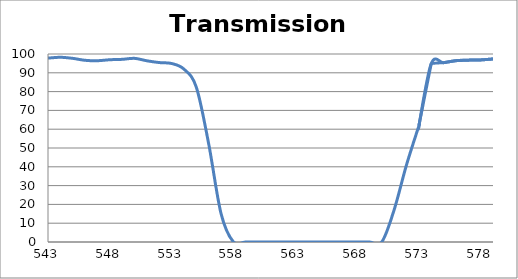
| Category | Transmission (%) |
|---|---|
| 2600.0 | 92.114 |
| 2599.0 | 92.203 |
| 2598.0 | 92.326 |
| 2597.0 | 92.426 |
| 2596.0 | 92.522 |
| 2595.0 | 92.617 |
| 2594.0 | 92.727 |
| 2593.0 | 92.835 |
| 2592.0 | 92.89 |
| 2591.0 | 92.995 |
| 2590.0 | 93.116 |
| 2589.0 | 93.186 |
| 2588.0 | 93.271 |
| 2587.0 | 93.36 |
| 2586.0 | 93.403 |
| 2585.0 | 93.418 |
| 2584.0 | 93.468 |
| 2583.0 | 93.502 |
| 2582.0 | 93.578 |
| 2581.0 | 93.599 |
| 2580.0 | 93.636 |
| 2579.0 | 93.667 |
| 2578.0 | 93.708 |
| 2577.0 | 93.737 |
| 2576.0 | 93.742 |
| 2575.0 | 93.785 |
| 2574.0 | 93.809 |
| 2573.0 | 93.809 |
| 2572.0 | 93.773 |
| 2571.0 | 93.778 |
| 2570.0 | 93.733 |
| 2569.0 | 93.734 |
| 2568.0 | 93.763 |
| 2567.0 | 93.677 |
| 2566.0 | 93.69 |
| 2565.0 | 93.678 |
| 2564.0 | 93.588 |
| 2563.0 | 93.552 |
| 2562.0 | 93.538 |
| 2561.0 | 93.467 |
| 2560.0 | 93.405 |
| 2559.0 | 93.328 |
| 2558.0 | 93.276 |
| 2557.0 | 93.203 |
| 2556.0 | 93.128 |
| 2555.0 | 92.994 |
| 2554.0 | 92.855 |
| 2553.0 | 92.7 |
| 2552.0 | 92.556 |
| 2551.0 | 92.392 |
| 2550.0 | 92.189 |
| 2549.0 | 92.025 |
| 2548.0 | 91.843 |
| 2547.0 | 91.636 |
| 2546.0 | 91.442 |
| 2545.0 | 91.264 |
| 2544.0 | 91.101 |
| 2543.0 | 90.962 |
| 2542.0 | 90.813 |
| 2541.0 | 90.681 |
| 2540.0 | 90.547 |
| 2539.0 | 90.412 |
| 2538.0 | 90.283 |
| 2537.0 | 90.152 |
| 2536.0 | 90.088 |
| 2535.0 | 89.992 |
| 2534.0 | 89.943 |
| 2533.0 | 89.9 |
| 2532.0 | 89.881 |
| 2531.0 | 89.858 |
| 2530.0 | 89.851 |
| 2529.0 | 89.848 |
| 2528.0 | 89.924 |
| 2527.0 | 89.988 |
| 2526.0 | 90.039 |
| 2525.0 | 90.13 |
| 2524.0 | 90.246 |
| 2523.0 | 90.4 |
| 2522.0 | 90.508 |
| 2521.0 | 90.605 |
| 2520.0 | 90.794 |
| 2519.0 | 90.948 |
| 2518.0 | 91.08 |
| 2517.0 | 91.257 |
| 2516.0 | 91.443 |
| 2515.0 | 91.589 |
| 2514.0 | 91.717 |
| 2513.0 | 91.81 |
| 2512.0 | 91.892 |
| 2511.0 | 91.968 |
| 2510.0 | 92.042 |
| 2509.0 | 92.045 |
| 2508.0 | 92.023 |
| 2507.0 | 91.958 |
| 2506.0 | 91.87 |
| 2505.0 | 91.759 |
| 2504.0 | 91.586 |
| 2503.0 | 91.426 |
| 2502.0 | 91.185 |
| 2501.0 | 90.9 |
| 2500.0 | 90.588 |
| 2499.0 | 90.236 |
| 2498.0 | 89.873 |
| 2497.0 | 89.489 |
| 2496.0 | 89.097 |
| 2495.0 | 88.667 |
| 2494.0 | 88.212 |
| 2493.0 | 87.712 |
| 2492.0 | 87.227 |
| 2491.0 | 86.74 |
| 2490.0 | 86.259 |
| 2489.0 | 85.813 |
| 2488.0 | 85.375 |
| 2487.0 | 84.913 |
| 2486.0 | 84.462 |
| 2485.0 | 84.022 |
| 2484.0 | 83.63 |
| 2483.0 | 83.297 |
| 2482.0 | 82.96 |
| 2481.0 | 82.649 |
| 2480.0 | 82.403 |
| 2479.0 | 82.187 |
| 2478.0 | 81.997 |
| 2477.0 | 81.872 |
| 2476.0 | 81.797 |
| 2475.0 | 81.761 |
| 2474.0 | 81.775 |
| 2473.0 | 81.842 |
| 2472.0 | 81.978 |
| 2471.0 | 82.159 |
| 2470.0 | 82.362 |
| 2469.0 | 82.623 |
| 2468.0 | 82.94 |
| 2467.0 | 83.262 |
| 2466.0 | 83.625 |
| 2465.0 | 84.072 |
| 2464.0 | 84.544 |
| 2463.0 | 85.013 |
| 2462.0 | 85.505 |
| 2461.0 | 85.97 |
| 2460.0 | 86.451 |
| 2459.0 | 86.948 |
| 2458.0 | 87.448 |
| 2457.0 | 87.901 |
| 2456.0 | 88.35 |
| 2455.0 | 88.74 |
| 2454.0 | 89.112 |
| 2453.0 | 89.479 |
| 2452.0 | 89.808 |
| 2451.0 | 90.079 |
| 2450.0 | 90.292 |
| 2449.0 | 90.456 |
| 2448.0 | 90.563 |
| 2447.0 | 90.604 |
| 2446.0 | 90.598 |
| 2445.0 | 90.521 |
| 2444.0 | 90.38 |
| 2443.0 | 90.214 |
| 2442.0 | 89.996 |
| 2441.0 | 89.702 |
| 2440.0 | 89.36 |
| 2439.0 | 88.974 |
| 2438.0 | 88.571 |
| 2437.0 | 88.156 |
| 2436.0 | 87.726 |
| 2435.0 | 87.284 |
| 2434.0 | 86.839 |
| 2433.0 | 86.407 |
| 2432.0 | 85.978 |
| 2431.0 | 85.581 |
| 2430.0 | 85.23 |
| 2429.0 | 84.921 |
| 2428.0 | 84.591 |
| 2427.0 | 84.298 |
| 2426.0 | 84.102 |
| 2425.0 | 83.939 |
| 2424.0 | 83.814 |
| 2423.0 | 83.741 |
| 2422.0 | 83.716 |
| 2421.0 | 83.725 |
| 2420.0 | 83.78 |
| 2419.0 | 83.899 |
| 2418.0 | 84.087 |
| 2417.0 | 84.31 |
| 2416.0 | 84.596 |
| 2415.0 | 84.92 |
| 2414.0 | 85.231 |
| 2413.0 | 85.578 |
| 2412.0 | 85.931 |
| 2411.0 | 86.288 |
| 2410.0 | 86.691 |
| 2409.0 | 87.113 |
| 2408.0 | 87.514 |
| 2407.0 | 87.905 |
| 2406.0 | 88.256 |
| 2405.0 | 88.558 |
| 2404.0 | 88.846 |
| 2403.0 | 89.115 |
| 2402.0 | 89.346 |
| 2401.0 | 89.502 |
| 2400.0 | 89.584 |
| 2399.0 | 89.629 |
| 2398.0 | 89.604 |
| 2397.0 | 89.496 |
| 2396.0 | 89.33 |
| 2395.0 | 89.074 |
| 2394.0 | 88.779 |
| 2393.0 | 88.453 |
| 2392.0 | 88.076 |
| 2391.0 | 87.604 |
| 2390.0 | 87.081 |
| 2389.0 | 86.55 |
| 2388.0 | 85.991 |
| 2387.0 | 85.445 |
| 2386.0 | 84.9 |
| 2385.0 | 84.362 |
| 2384.0 | 83.847 |
| 2383.0 | 83.309 |
| 2382.0 | 82.804 |
| 2381.0 | 82.363 |
| 2380.0 | 81.969 |
| 2379.0 | 81.614 |
| 2378.0 | 81.318 |
| 2377.0 | 81.067 |
| 2376.0 | 80.852 |
| 2375.0 | 80.692 |
| 2374.0 | 80.602 |
| 2373.0 | 80.591 |
| 2372.0 | 80.656 |
| 2371.0 | 80.78 |
| 2370.0 | 80.923 |
| 2369.0 | 81.111 |
| 2368.0 | 81.364 |
| 2367.0 | 81.653 |
| 2366.0 | 82.005 |
| 2365.0 | 82.397 |
| 2364.0 | 82.793 |
| 2363.0 | 83.24 |
| 2362.0 | 83.716 |
| 2361.0 | 84.165 |
| 2360.0 | 84.607 |
| 2359.0 | 85.027 |
| 2358.0 | 85.408 |
| 2357.0 | 85.787 |
| 2356.0 | 86.123 |
| 2355.0 | 86.419 |
| 2354.0 | 86.63 |
| 2353.0 | 86.754 |
| 2352.0 | 86.8 |
| 2351.0 | 86.745 |
| 2350.0 | 86.572 |
| 2349.0 | 86.339 |
| 2348.0 | 86.043 |
| 2347.0 | 85.715 |
| 2346.0 | 85.34 |
| 2345.0 | 84.838 |
| 2344.0 | 84.289 |
| 2343.0 | 83.681 |
| 2342.0 | 83.014 |
| 2341.0 | 82.342 |
| 2340.0 | 81.665 |
| 2339.0 | 81.003 |
| 2338.0 | 80.357 |
| 2337.0 | 79.719 |
| 2336.0 | 79.093 |
| 2335.0 | 78.511 |
| 2334.0 | 77.98 |
| 2333.0 | 77.496 |
| 2332.0 | 77.067 |
| 2331.0 | 76.692 |
| 2330.0 | 76.376 |
| 2329.0 | 76.123 |
| 2328.0 | 75.954 |
| 2327.0 | 75.87 |
| 2326.0 | 75.825 |
| 2325.0 | 75.848 |
| 2324.0 | 75.953 |
| 2323.0 | 76.137 |
| 2322.0 | 76.36 |
| 2321.0 | 76.633 |
| 2320.0 | 76.984 |
| 2319.0 | 77.402 |
| 2318.0 | 77.836 |
| 2317.0 | 78.335 |
| 2316.0 | 78.832 |
| 2315.0 | 79.321 |
| 2314.0 | 79.816 |
| 2313.0 | 80.295 |
| 2312.0 | 80.716 |
| 2311.0 | 81.096 |
| 2310.0 | 81.426 |
| 2309.0 | 81.725 |
| 2308.0 | 81.911 |
| 2307.0 | 82.015 |
| 2306.0 | 82.014 |
| 2305.0 | 81.872 |
| 2304.0 | 81.654 |
| 2303.0 | 81.322 |
| 2302.0 | 80.933 |
| 2301.0 | 80.404 |
| 2300.0 | 79.864 |
| 2299.0 | 79.216 |
| 2298.0 | 78.52 |
| 2297.0 | 77.739 |
| 2296.0 | 76.943 |
| 2295.0 | 76.161 |
| 2294.0 | 75.367 |
| 2293.0 | 74.579 |
| 2292.0 | 73.86 |
| 2291.0 | 73.127 |
| 2290.0 | 72.459 |
| 2289.0 | 71.822 |
| 2288.0 | 71.205 |
| 2287.0 | 70.674 |
| 2286.0 | 70.237 |
| 2285.0 | 69.912 |
| 2284.0 | 69.679 |
| 2283.0 | 69.542 |
| 2282.0 | 69.471 |
| 2281.0 | 69.516 |
| 2280.0 | 69.683 |
| 2279.0 | 69.974 |
| 2278.0 | 70.361 |
| 2277.0 | 70.873 |
| 2276.0 | 71.5 |
| 2275.0 | 72.21 |
| 2274.0 | 73.044 |
| 2273.0 | 74.012 |
| 2272.0 | 74.997 |
| 2271.0 | 76.1 |
| 2270.0 | 77.226 |
| 2269.0 | 78.386 |
| 2268.0 | 79.56 |
| 2267.0 | 80.751 |
| 2266.0 | 81.933 |
| 2265.0 | 83.088 |
| 2264.0 | 84.159 |
| 2263.0 | 85.154 |
| 2262.0 | 86.013 |
| 2261.0 | 86.715 |
| 2260.0 | 87.261 |
| 2259.0 | 87.683 |
| 2258.0 | 87.881 |
| 2257.0 | 87.915 |
| 2256.0 | 87.762 |
| 2255.0 | 87.412 |
| 2254.0 | 86.896 |
| 2253.0 | 86.266 |
| 2252.0 | 85.499 |
| 2251.0 | 84.605 |
| 2250.0 | 83.656 |
| 2249.0 | 82.619 |
| 2248.0 | 81.547 |
| 2247.0 | 80.44 |
| 2246.0 | 79.296 |
| 2245.0 | 78.209 |
| 2244.0 | 77.187 |
| 2243.0 | 76.194 |
| 2242.0 | 75.237 |
| 2241.0 | 74.398 |
| 2240.0 | 73.686 |
| 2239.0 | 73.004 |
| 2238.0 | 72.417 |
| 2237.0 | 71.992 |
| 2236.0 | 71.707 |
| 2235.0 | 71.549 |
| 2234.0 | 71.463 |
| 2233.0 | 71.571 |
| 2232.0 | 71.741 |
| 2231.0 | 72.056 |
| 2230.0 | 72.432 |
| 2229.0 | 72.905 |
| 2228.0 | 73.527 |
| 2227.0 | 74.196 |
| 2226.0 | 74.937 |
| 2225.0 | 75.733 |
| 2224.0 | 76.554 |
| 2223.0 | 77.41 |
| 2222.0 | 78.229 |
| 2221.0 | 79.041 |
| 2220.0 | 79.817 |
| 2219.0 | 80.507 |
| 2218.0 | 81.139 |
| 2217.0 | 81.705 |
| 2216.0 | 82.09 |
| 2215.0 | 82.362 |
| 2214.0 | 82.549 |
| 2213.0 | 82.603 |
| 2212.0 | 82.515 |
| 2211.0 | 82.335 |
| 2210.0 | 82.031 |
| 2209.0 | 81.583 |
| 2208.0 | 81.055 |
| 2207.0 | 80.527 |
| 2206.0 | 79.835 |
| 2205.0 | 79.146 |
| 2204.0 | 78.444 |
| 2203.0 | 77.75 |
| 2202.0 | 77.098 |
| 2201.0 | 76.398 |
| 2200.0 | 75.75 |
| 2199.0 | 75.159 |
| 2198.0 | 74.718 |
| 2197.0 | 74.377 |
| 2196.0 | 74.076 |
| 2195.0 | 73.891 |
| 2194.0 | 73.82 |
| 2193.0 | 73.89 |
| 2192.0 | 74.076 |
| 2191.0 | 74.38 |
| 2190.0 | 74.731 |
| 2189.0 | 75.224 |
| 2188.0 | 75.844 |
| 2187.0 | 76.585 |
| 2186.0 | 77.375 |
| 2185.0 | 78.232 |
| 2184.0 | 79.096 |
| 2183.0 | 80.01 |
| 2182.0 | 80.997 |
| 2181.0 | 81.867 |
| 2180.0 | 82.7 |
| 2179.0 | 83.503 |
| 2178.0 | 84.257 |
| 2177.0 | 84.85 |
| 2176.0 | 85.325 |
| 2175.0 | 85.646 |
| 2174.0 | 85.855 |
| 2173.0 | 85.897 |
| 2172.0 | 85.772 |
| 2171.0 | 85.475 |
| 2170.0 | 85.06 |
| 2169.0 | 84.484 |
| 2168.0 | 83.795 |
| 2167.0 | 83.003 |
| 2166.0 | 82.185 |
| 2165.0 | 81.238 |
| 2164.0 | 80.28 |
| 2163.0 | 79.319 |
| 2162.0 | 78.383 |
| 2161.0 | 77.481 |
| 2160.0 | 76.658 |
| 2159.0 | 75.871 |
| 2158.0 | 75.225 |
| 2157.0 | 74.662 |
| 2156.0 | 74.258 |
| 2155.0 | 73.988 |
| 2154.0 | 73.807 |
| 2153.0 | 73.806 |
| 2152.0 | 73.993 |
| 2151.0 | 74.313 |
| 2150.0 | 74.743 |
| 2149.0 | 75.312 |
| 2148.0 | 76.036 |
| 2147.0 | 76.903 |
| 2146.0 | 77.842 |
| 2145.0 | 78.872 |
| 2144.0 | 79.958 |
| 2143.0 | 81.106 |
| 2142.0 | 82.284 |
| 2141.0 | 83.367 |
| 2140.0 | 84.429 |
| 2139.0 | 85.375 |
| 2138.0 | 86.192 |
| 2137.0 | 86.901 |
| 2136.0 | 87.356 |
| 2135.0 | 87.608 |
| 2134.0 | 87.634 |
| 2133.0 | 87.436 |
| 2132.0 | 87.013 |
| 2131.0 | 86.331 |
| 2130.0 | 85.413 |
| 2129.0 | 84.308 |
| 2128.0 | 83.026 |
| 2127.0 | 81.662 |
| 2126.0 | 80.14 |
| 2125.0 | 78.51 |
| 2124.0 | 76.882 |
| 2123.0 | 75.316 |
| 2122.0 | 73.677 |
| 2121.0 | 72.13 |
| 2120.0 | 70.665 |
| 2119.0 | 69.301 |
| 2118.0 | 68.107 |
| 2117.0 | 66.964 |
| 2116.0 | 65.979 |
| 2115.0 | 65.133 |
| 2114.0 | 64.447 |
| 2113.0 | 63.881 |
| 2112.0 | 63.437 |
| 2111.0 | 63.155 |
| 2110.0 | 63.023 |
| 2109.0 | 63.027 |
| 2108.0 | 63.117 |
| 2107.0 | 63.33 |
| 2106.0 | 63.643 |
| 2105.0 | 64.061 |
| 2104.0 | 64.494 |
| 2103.0 | 64.99 |
| 2102.0 | 65.523 |
| 2101.0 | 66.069 |
| 2100.0 | 66.637 |
| 2099.0 | 67.144 |
| 2098.0 | 67.607 |
| 2097.0 | 68.006 |
| 2096.0 | 68.336 |
| 2095.0 | 68.573 |
| 2094.0 | 68.68 |
| 2093.0 | 68.672 |
| 2092.0 | 68.57 |
| 2091.0 | 68.364 |
| 2090.0 | 68.071 |
| 2089.0 | 67.706 |
| 2088.0 | 67.216 |
| 2087.0 | 66.686 |
| 2086.0 | 66.093 |
| 2085.0 | 65.486 |
| 2084.0 | 64.868 |
| 2083.0 | 64.233 |
| 2082.0 | 63.632 |
| 2081.0 | 63.105 |
| 2080.0 | 62.645 |
| 2079.0 | 62.249 |
| 2078.0 | 61.912 |
| 2077.0 | 61.674 |
| 2076.0 | 61.573 |
| 2075.0 | 61.605 |
| 2074.0 | 61.765 |
| 2073.0 | 62.036 |
| 2072.0 | 62.422 |
| 2071.0 | 62.942 |
| 2070.0 | 63.592 |
| 2069.0 | 64.36 |
| 2068.0 | 65.202 |
| 2067.0 | 66.142 |
| 2066.0 | 67.193 |
| 2065.0 | 68.342 |
| 2064.0 | 69.512 |
| 2063.0 | 70.673 |
| 2062.0 | 71.832 |
| 2061.0 | 72.968 |
| 2060.0 | 74.052 |
| 2059.0 | 75.099 |
| 2058.0 | 76.036 |
| 2057.0 | 76.777 |
| 2056.0 | 77.364 |
| 2055.0 | 77.788 |
| 2054.0 | 78.062 |
| 2053.0 | 78.15 |
| 2052.0 | 78.051 |
| 2051.0 | 77.783 |
| 2050.0 | 77.392 |
| 2049.0 | 76.883 |
| 2048.0 | 76.269 |
| 2047.0 | 75.544 |
| 2046.0 | 74.752 |
| 2045.0 | 73.93 |
| 2044.0 | 73.136 |
| 2043.0 | 72.363 |
| 2042.0 | 71.593 |
| 2041.0 | 70.912 |
| 2040.0 | 70.321 |
| 2039.0 | 69.795 |
| 2038.0 | 69.343 |
| 2037.0 | 69.016 |
| 2036.0 | 68.813 |
| 2035.0 | 68.721 |
| 2034.0 | 68.756 |
| 2033.0 | 68.882 |
| 2032.0 | 69.135 |
| 2031.0 | 69.519 |
| 2030.0 | 70.001 |
| 2029.0 | 70.566 |
| 2028.0 | 71.207 |
| 2027.0 | 71.941 |
| 2026.0 | 72.763 |
| 2025.0 | 73.627 |
| 2024.0 | 74.508 |
| 2023.0 | 75.424 |
| 2022.0 | 76.39 |
| 2021.0 | 77.367 |
| 2020.0 | 78.346 |
| 2019.0 | 79.294 |
| 2018.0 | 80.229 |
| 2017.0 | 81.18 |
| 2016.0 | 82.079 |
| 2015.0 | 82.958 |
| 2014.0 | 83.822 |
| 2013.0 | 84.667 |
| 2012.0 | 85.542 |
| 2011.0 | 86.372 |
| 2010.0 | 87.173 |
| 2009.0 | 87.979 |
| 2008.0 | 88.755 |
| 2007.0 | 89.537 |
| 2006.0 | 90.307 |
| 2005.0 | 91.033 |
| 2004.0 | 91.707 |
| 2003.0 | 92.313 |
| 2002.0 | 92.868 |
| 2001.0 | 93.336 |
| 2000.0 | 93.669 |
| 1999.0 | 93.879 |
| 1998.0 | 93.948 |
| 1997.0 | 93.819 |
| 1996.0 | 93.5 |
| 1995.0 | 92.955 |
| 1994.0 | 92.21 |
| 1993.0 | 91.282 |
| 1992.0 | 90.119 |
| 1991.0 | 88.781 |
| 1990.0 | 87.288 |
| 1989.0 | 85.698 |
| 1988.0 | 84.021 |
| 1987.0 | 82.291 |
| 1986.0 | 80.491 |
| 1985.0 | 78.798 |
| 1984.0 | 77.167 |
| 1983.0 | 75.58 |
| 1982.0 | 74.12 |
| 1981.0 | 72.798 |
| 1980.0 | 71.617 |
| 1979.0 | 70.606 |
| 1978.0 | 69.786 |
| 1977.0 | 69.136 |
| 1976.0 | 68.681 |
| 1975.0 | 68.413 |
| 1974.0 | 68.326 |
| 1973.0 | 68.438 |
| 1972.0 | 68.759 |
| 1971.0 | 69.276 |
| 1970.0 | 70.02 |
| 1969.0 | 70.972 |
| 1968.0 | 72.101 |
| 1967.0 | 73.411 |
| 1966.0 | 74.934 |
| 1965.0 | 76.539 |
| 1964.0 | 78.253 |
| 1963.0 | 80.189 |
| 1962.0 | 82.126 |
| 1961.0 | 83.988 |
| 1960.0 | 85.848 |
| 1959.0 | 87.609 |
| 1958.0 | 89.233 |
| 1957.0 | 90.589 |
| 1956.0 | 91.559 |
| 1955.0 | 92.261 |
| 1954.0 | 92.554 |
| 1953.0 | 92.518 |
| 1952.0 | 92.124 |
| 1951.0 | 91.437 |
| 1950.0 | 90.466 |
| 1949.0 | 89.225 |
| 1948.0 | 87.906 |
| 1947.0 | 86.515 |
| 1946.0 | 85.011 |
| 1945.0 | 83.576 |
| 1944.0 | 82.211 |
| 1943.0 | 80.979 |
| 1942.0 | 79.886 |
| 1941.0 | 78.949 |
| 1940.0 | 78.174 |
| 1939.0 | 77.585 |
| 1938.0 | 77.181 |
| 1937.0 | 76.973 |
| 1936.0 | 76.948 |
| 1935.0 | 77.127 |
| 1934.0 | 77.45 |
| 1933.0 | 77.943 |
| 1932.0 | 78.558 |
| 1931.0 | 79.307 |
| 1930.0 | 80.103 |
| 1929.0 | 81.023 |
| 1928.0 | 82.019 |
| 1927.0 | 82.998 |
| 1926.0 | 83.966 |
| 1925.0 | 84.859 |
| 1924.0 | 85.663 |
| 1923.0 | 86.411 |
| 1922.0 | 87.073 |
| 1921.0 | 87.595 |
| 1920.0 | 87.899 |
| 1919.0 | 88.081 |
| 1918.0 | 88.189 |
| 1917.0 | 88.176 |
| 1916.0 | 88.057 |
| 1915.0 | 87.784 |
| 1914.0 | 87.401 |
| 1913.0 | 86.995 |
| 1912.0 | 86.661 |
| 1911.0 | 86.349 |
| 1910.0 | 86.134 |
| 1909.0 | 85.925 |
| 1908.0 | 85.747 |
| 1907.0 | 85.613 |
| 1906.0 | 85.493 |
| 1905.0 | 85.513 |
| 1904.0 | 85.556 |
| 1903.0 | 85.68 |
| 1902.0 | 85.798 |
| 1901.0 | 85.88 |
| 1900.0 | 85.963 |
| 1899.0 | 85.903 |
| 1898.0 | 85.831 |
| 1897.0 | 85.835 |
| 1896.0 | 85.675 |
| 1895.0 | 85.323 |
| 1894.0 | 84.941 |
| 1893.0 | 84.425 |
| 1892.0 | 83.714 |
| 1891.0 | 82.938 |
| 1890.0 | 82.119 |
| 1889.0 | 81.248 |
| 1888.0 | 80.487 |
| 1887.0 | 79.694 |
| 1886.0 | 78.926 |
| 1885.0 | 78.159 |
| 1884.0 | 77.407 |
| 1883.0 | 76.837 |
| 1882.0 | 76.331 |
| 1881.0 | 76.04 |
| 1880.0 | 75.925 |
| 1879.0 | 75.915 |
| 1878.0 | 76.109 |
| 1877.0 | 76.319 |
| 1876.0 | 76.681 |
| 1875.0 | 77.219 |
| 1874.0 | 77.893 |
| 1873.0 | 78.614 |
| 1872.0 | 79.37 |
| 1871.0 | 80.133 |
| 1870.0 | 80.884 |
| 1869.0 | 81.518 |
| 1868.0 | 82.027 |
| 1867.0 | 82.244 |
| 1866.0 | 82.422 |
| 1865.0 | 82.332 |
| 1864.0 | 82.026 |
| 1863.0 | 81.557 |
| 1862.0 | 80.829 |
| 1861.0 | 79.768 |
| 1860.0 | 78.57 |
| 1859.0 | 77.327 |
| 1858.0 | 76.112 |
| 1857.0 | 74.97 |
| 1856.0 | 73.909 |
| 1855.0 | 72.831 |
| 1854.0 | 71.789 |
| 1853.0 | 70.908 |
| 1852.0 | 70.202 |
| 1851.0 | 69.802 |
| 1850.0 | 69.548 |
| 1849.0 | 69.559 |
| 1848.0 | 69.622 |
| 1847.0 | 69.915 |
| 1846.0 | 70.52 |
| 1845.0 | 71.021 |
| 1844.0 | 71.988 |
| 1843.0 | 73.13 |
| 1842.0 | 74.745 |
| 1841.0 | 76.25 |
| 1840.0 | 77.744 |
| 1839.0 | 79.308 |
| 1838.0 | 80.756 |
| 1837.0 | 82.458 |
| 1836.0 | 83.909 |
| 1835.0 | 85.172 |
| 1834.0 | 86.064 |
| 1833.0 | 86.671 |
| 1832.0 | 87.112 |
| 1831.0 | 87.102 |
| 1830.0 | 86.869 |
| 1829.0 | 86.422 |
| 1828.0 | 85.815 |
| 1827.0 | 84.972 |
| 1826.0 | 84.027 |
| 1825.0 | 83.234 |
| 1824.0 | 82.433 |
| 1823.0 | 81.792 |
| 1822.0 | 81.14 |
| 1821.0 | 80.575 |
| 1820.0 | 79.985 |
| 1819.0 | 79.873 |
| 1818.0 | 79.865 |
| 1817.0 | 80.071 |
| 1816.0 | 80.452 |
| 1815.0 | 80.982 |
| 1814.0 | 81.577 |
| 1813.0 | 82.277 |
| 1812.0 | 83.064 |
| 1811.0 | 83.874 |
| 1810.0 | 84.664 |
| 1809.0 | 85.379 |
| 1808.0 | 85.904 |
| 1807.0 | 86.306 |
| 1806.0 | 86.562 |
| 1805.0 | 86.591 |
| 1804.0 | 86.428 |
| 1803.0 | 86.056 |
| 1802.0 | 85.45 |
| 1801.0 | 84.627 |
| 1800.0 | 83.691 |
| 1799.0 | 82.722 |
| 1798.0 | 81.666 |
| 1797.0 | 80.726 |
| 1796.0 | 79.78 |
| 1795.0 | 78.902 |
| 1794.0 | 78.136 |
| 1793.0 | 77.526 |
| 1792.0 | 77.077 |
| 1791.0 | 76.83 |
| 1790.0 | 76.716 |
| 1789.0 | 76.771 |
| 1788.0 | 76.951 |
| 1787.0 | 77.254 |
| 1786.0 | 77.658 |
| 1785.0 | 78.084 |
| 1784.0 | 78.51 |
| 1783.0 | 78.925 |
| 1782.0 | 79.232 |
| 1781.0 | 79.561 |
| 1780.0 | 79.725 |
| 1779.0 | 79.708 |
| 1778.0 | 79.539 |
| 1777.0 | 79.253 |
| 1776.0 | 78.851 |
| 1775.0 | 78.327 |
| 1774.0 | 77.712 |
| 1773.0 | 77.054 |
| 1772.0 | 76.33 |
| 1771.0 | 75.7 |
| 1770.0 | 75.11 |
| 1769.0 | 74.546 |
| 1768.0 | 74.09 |
| 1767.0 | 73.759 |
| 1766.0 | 73.535 |
| 1765.0 | 73.498 |
| 1764.0 | 73.616 |
| 1763.0 | 73.883 |
| 1762.0 | 74.287 |
| 1761.0 | 74.79 |
| 1760.0 | 75.379 |
| 1759.0 | 76.043 |
| 1758.0 | 76.758 |
| 1757.0 | 77.395 |
| 1756.0 | 77.969 |
| 1755.0 | 78.468 |
| 1754.0 | 78.848 |
| 1753.0 | 79.043 |
| 1752.0 | 79.083 |
| 1751.0 | 78.937 |
| 1750.0 | 78.607 |
| 1749.0 | 78.149 |
| 1748.0 | 77.577 |
| 1747.0 | 76.976 |
| 1746.0 | 76.333 |
| 1745.0 | 75.745 |
| 1744.0 | 75.192 |
| 1743.0 | 74.765 |
| 1742.0 | 74.451 |
| 1741.0 | 74.345 |
| 1740.0 | 74.361 |
| 1739.0 | 74.542 |
| 1738.0 | 74.919 |
| 1737.0 | 75.448 |
| 1736.0 | 76.111 |
| 1735.0 | 76.893 |
| 1734.0 | 77.764 |
| 1733.0 | 78.679 |
| 1732.0 | 79.619 |
| 1731.0 | 80.522 |
| 1730.0 | 81.308 |
| 1729.0 | 81.968 |
| 1728.0 | 82.433 |
| 1727.0 | 82.672 |
| 1726.0 | 82.692 |
| 1725.0 | 82.496 |
| 1724.0 | 82.11 |
| 1723.0 | 81.488 |
| 1722.0 | 80.699 |
| 1721.0 | 79.829 |
| 1720.0 | 78.917 |
| 1719.0 | 78.025 |
| 1718.0 | 77.172 |
| 1717.0 | 76.444 |
| 1716.0 | 75.844 |
| 1715.0 | 75.416 |
| 1714.0 | 75.18 |
| 1713.0 | 75.143 |
| 1712.0 | 75.279 |
| 1711.0 | 75.566 |
| 1710.0 | 76 |
| 1709.0 | 76.554 |
| 1708.0 | 77.158 |
| 1707.0 | 77.795 |
| 1706.0 | 78.4 |
| 1705.0 | 78.927 |
| 1704.0 | 79.343 |
| 1703.0 | 79.603 |
| 1702.0 | 79.711 |
| 1701.0 | 79.618 |
| 1700.0 | 79.37 |
| 1699.0 | 78.971 |
| 1698.0 | 78.453 |
| 1697.0 | 77.831 |
| 1696.0 | 77.156 |
| 1695.0 | 76.477 |
| 1694.0 | 75.843 |
| 1693.0 | 75.284 |
| 1692.0 | 74.829 |
| 1691.0 | 74.507 |
| 1690.0 | 74.281 |
| 1689.0 | 74.213 |
| 1688.0 | 74.291 |
| 1687.0 | 74.476 |
| 1686.0 | 74.759 |
| 1685.0 | 75.116 |
| 1684.0 | 75.499 |
| 1683.0 | 75.891 |
| 1682.0 | 76.255 |
| 1681.0 | 76.514 |
| 1680.0 | 76.649 |
| 1679.0 | 76.655 |
| 1678.0 | 76.488 |
| 1677.0 | 76.14 |
| 1676.0 | 75.63 |
| 1675.0 | 75.005 |
| 1674.0 | 74.3 |
| 1673.0 | 73.559 |
| 1672.0 | 72.829 |
| 1671.0 | 72.164 |
| 1670.0 | 71.611 |
| 1669.0 | 71.167 |
| 1668.0 | 70.849 |
| 1667.0 | 70.751 |
| 1666.0 | 70.799 |
| 1665.0 | 71.007 |
| 1664.0 | 71.352 |
| 1663.0 | 71.782 |
| 1662.0 | 72.279 |
| 1661.0 | 72.805 |
| 1660.0 | 73.289 |
| 1659.0 | 73.656 |
| 1658.0 | 73.889 |
| 1657.0 | 73.937 |
| 1656.0 | 73.763 |
| 1655.0 | 73.363 |
| 1654.0 | 72.749 |
| 1653.0 | 71.926 |
| 1652.0 | 70.947 |
| 1651.0 | 69.854 |
| 1650.0 | 68.678 |
| 1649.0 | 67.491 |
| 1648.0 | 66.387 |
| 1647.0 | 65.393 |
| 1646.0 | 64.564 |
| 1645.0 | 63.939 |
| 1644.0 | 63.509 |
| 1643.0 | 63.296 |
| 1642.0 | 63.326 |
| 1641.0 | 63.628 |
| 1640.0 | 64.198 |
| 1639.0 | 65.003 |
| 1638.0 | 66.005 |
| 1637.0 | 67.147 |
| 1636.0 | 68.418 |
| 1635.0 | 69.775 |
| 1634.0 | 71.103 |
| 1633.0 | 72.371 |
| 1632.0 | 73.538 |
| 1631.0 | 74.481 |
| 1630.0 | 75.173 |
| 1629.0 | 75.62 |
| 1628.0 | 75.816 |
| 1627.0 | 75.798 |
| 1626.0 | 75.612 |
| 1625.0 | 75.302 |
| 1624.0 | 74.918 |
| 1623.0 | 74.542 |
| 1622.0 | 74.186 |
| 1621.0 | 73.892 |
| 1620.0 | 73.695 |
| 1619.0 | 73.621 |
| 1618.0 | 73.667 |
| 1617.0 | 73.817 |
| 1616.0 | 74.068 |
| 1615.0 | 74.39 |
| 1614.0 | 74.731 |
| 1613.0 | 75.078 |
| 1612.0 | 75.411 |
| 1611.0 | 75.673 |
| 1610.0 | 75.86 |
| 1609.0 | 75.982 |
| 1608.0 | 75.977 |
| 1607.0 | 75.88 |
| 1606.0 | 75.736 |
| 1605.0 | 75.523 |
| 1604.0 | 75.284 |
| 1603.0 | 75.045 |
| 1602.0 | 74.835 |
| 1601.0 | 74.685 |
| 1600.0 | 74.592 |
| 1599.0 | 74.56 |
| 1598.0 | 74.605 |
| 1597.0 | 74.693 |
| 1596.0 | 74.79 |
| 1595.0 | 74.84 |
| 1594.0 | 74.827 |
| 1593.0 | 74.683 |
| 1592.0 | 74.398 |
| 1591.0 | 73.944 |
| 1590.0 | 73.323 |
| 1589.0 | 72.512 |
| 1588.0 | 71.551 |
| 1587.0 | 70.472 |
| 1586.0 | 69.382 |
| 1585.0 | 68.288 |
| 1584.0 | 67.319 |
| 1583.0 | 66.477 |
| 1582.0 | 65.796 |
| 1581.0 | 65.307 |
| 1580.0 | 65.053 |
| 1579.0 | 65.04 |
| 1578.0 | 65.287 |
| 1577.0 | 65.753 |
| 1576.0 | 66.415 |
| 1575.0 | 67.268 |
| 1574.0 | 68.225 |
| 1573.0 | 69.228 |
| 1572.0 | 70.203 |
| 1571.0 | 71.121 |
| 1570.0 | 71.831 |
| 1569.0 | 72.272 |
| 1568.0 | 72.417 |
| 1567.0 | 72.266 |
| 1566.0 | 71.798 |
| 1565.0 | 71.081 |
| 1564.0 | 70.149 |
| 1563.0 | 69.097 |
| 1562.0 | 67.986 |
| 1561.0 | 66.911 |
| 1560.0 | 65.979 |
| 1559.0 | 65.183 |
| 1558.0 | 64.682 |
| 1557.0 | 64.396 |
| 1556.0 | 64.341 |
| 1555.0 | 64.503 |
| 1554.0 | 64.844 |
| 1553.0 | 65.356 |
| 1552.0 | 65.92 |
| 1551.0 | 66.577 |
| 1550.0 | 67.149 |
| 1549.0 | 67.564 |
| 1548.0 | 67.791 |
| 1547.0 | 67.818 |
| 1546.0 | 67.631 |
| 1545.0 | 67.267 |
| 1544.0 | 66.736 |
| 1543.0 | 66.117 |
| 1542.0 | 65.47 |
| 1541.0 | 64.86 |
| 1540.0 | 64.412 |
| 1539.0 | 64.088 |
| 1538.0 | 63.927 |
| 1537.0 | 63.975 |
| 1536.0 | 64.261 |
| 1535.0 | 64.785 |
| 1534.0 | 65.484 |
| 1533.0 | 66.336 |
| 1532.0 | 67.282 |
| 1531.0 | 68.224 |
| 1530.0 | 69.167 |
| 1529.0 | 70.017 |
| 1528.0 | 70.648 |
| 1527.0 | 71.031 |
| 1526.0 | 71.149 |
| 1525.0 | 71.033 |
| 1524.0 | 70.665 |
| 1523.0 | 70.135 |
| 1522.0 | 69.502 |
| 1521.0 | 68.873 |
| 1520.0 | 68.293 |
| 1519.0 | 67.874 |
| 1518.0 | 67.573 |
| 1517.0 | 67.447 |
| 1516.0 | 67.526 |
| 1515.0 | 67.794 |
| 1514.0 | 68.23 |
| 1513.0 | 68.758 |
| 1512.0 | 69.258 |
| 1511.0 | 69.727 |
| 1510.0 | 70.111 |
| 1509.0 | 70.319 |
| 1508.0 | 70.352 |
| 1507.0 | 70.165 |
| 1506.0 | 69.853 |
| 1505.0 | 69.388 |
| 1504.0 | 68.843 |
| 1503.0 | 68.316 |
| 1502.0 | 67.798 |
| 1501.0 | 67.416 |
| 1500.0 | 67.162 |
| 1499.0 | 67.08 |
| 1498.0 | 67.064 |
| 1497.0 | 67.112 |
| 1496.0 | 67.217 |
| 1495.0 | 67.268 |
| 1494.0 | 67.244 |
| 1493.0 | 67.06 |
| 1492.0 | 66.637 |
| 1491.0 | 66.024 |
| 1490.0 | 65.116 |
| 1489.0 | 64.029 |
| 1488.0 | 62.8 |
| 1487.0 | 61.492 |
| 1486.0 | 60.232 |
| 1485.0 | 59.077 |
| 1484.0 | 58.085 |
| 1483.0 | 57.471 |
| 1482.0 | 57.078 |
| 1481.0 | 57.014 |
| 1480.0 | 57.262 |
| 1479.0 | 57.768 |
| 1478.0 | 58.513 |
| 1477.0 | 59.362 |
| 1476.0 | 60.187 |
| 1475.0 | 60.794 |
| 1474.0 | 61.064 |
| 1473.0 | 60.858 |
| 1472.0 | 60.136 |
| 1471.0 | 58.733 |
| 1470.0 | 57.053 |
| 1469.0 | 55.12 |
| 1468.0 | 53.02 |
| 1467.0 | 51.075 |
| 1466.0 | 49.291 |
| 1465.0 | 47.777 |
| 1464.0 | 46.598 |
| 1463.0 | 45.889 |
| 1462.0 | 45.517 |
| 1461.0 | 45.573 |
| 1460.0 | 46.003 |
| 1459.0 | 46.783 |
| 1458.0 | 47.872 |
| 1457.0 | 49.105 |
| 1456.0 | 50.379 |
| 1455.0 | 51.622 |
| 1454.0 | 52.541 |
| 1453.0 | 53.178 |
| 1452.0 | 53.384 |
| 1451.0 | 53.157 |
| 1450.0 | 52.466 |
| 1449.0 | 51.489 |
| 1448.0 | 50.306 |
| 1447.0 | 49.215 |
| 1446.0 | 48.302 |
| 1445.0 | 47.4 |
| 1444.0 | 46.928 |
| 1443.0 | 46.843 |
| 1442.0 | 47.194 |
| 1441.0 | 47.961 |
| 1440.0 | 49.129 |
| 1439.0 | 50.557 |
| 1438.0 | 52.184 |
| 1437.0 | 53.794 |
| 1436.0 | 55.241 |
| 1435.0 | 56.304 |
| 1434.0 | 56.861 |
| 1433.0 | 56.851 |
| 1432.0 | 56.274 |
| 1431.0 | 55.26 |
| 1430.0 | 53.989 |
| 1429.0 | 52.741 |
| 1428.0 | 51.595 |
| 1427.0 | 50.728 |
| 1426.0 | 50.268 |
| 1425.0 | 50.286 |
| 1424.0 | 50.74 |
| 1423.0 | 51.627 |
| 1422.0 | 52.881 |
| 1421.0 | 54.479 |
| 1420.0 | 56.367 |
| 1419.0 | 58.24 |
| 1418.0 | 59.795 |
| 1417.0 | 60.944 |
| 1416.0 | 61.787 |
| 1415.0 | 62.047 |
| 1414.0 | 61.629 |
| 1413.0 | 60.676 |
| 1412.0 | 59.676 |
| 1411.0 | 58.576 |
| 1410.0 | 57.651 |
| 1409.0 | 56.826 |
| 1408.0 | 56.303 |
| 1407.0 | 56.209 |
| 1406.0 | 56.528 |
| 1405.0 | 57.272 |
| 1404.0 | 58.357 |
| 1403.0 | 59.543 |
| 1402.0 | 60.735 |
| 1401.0 | 61.882 |
| 1400.0 | 62.766 |
| 1399.0 | 62.865 |
| 1398.0 | 62.735 |
| 1397.0 | 62.339 |
| 1396.0 | 61.518 |
| 1395.0 | 60.271 |
| 1394.0 | 59.249 |
| 1393.0 | 58.442 |
| 1392.0 | 57.926 |
| 1391.0 | 57.806 |
| 1390.0 | 58.006 |
| 1389.0 | 58.584 |
| 1388.0 | 59.317 |
| 1387.0 | 59.979 |
| 1386.0 | 60.513 |
| 1385.0 | 60.832 |
| 1384.0 | 60.756 |
| 1383.0 | 60.038 |
| 1382.0 | 58.739 |
| 1381.0 | 56.977 |
| 1380.0 | 55.333 |
| 1379.0 | 53.802 |
| 1378.0 | 52.397 |
| 1377.0 | 51.24 |
| 1376.0 | 50.515 |
| 1375.0 | 50.121 |
| 1374.0 | 50.131 |
| 1373.0 | 50.599 |
| 1372.0 | 51.515 |
| 1371.0 | 52.739 |
| 1370.0 | 54.153 |
| 1369.0 | 55.497 |
| 1368.0 | 56.745 |
| 1367.0 | 57.687 |
| 1366.0 | 58.034 |
| 1365.0 | 57.857 |
| 1364.0 | 57.225 |
| 1363.0 | 56.238 |
| 1362.0 | 54.868 |
| 1361.0 | 53.363 |
| 1360.0 | 52.241 |
| 1359.0 | 51.437 |
| 1358.0 | 51.085 |
| 1357.0 | 51.198 |
| 1356.0 | 51.711 |
| 1355.0 | 52.572 |
| 1354.0 | 53.701 |
| 1353.0 | 55.067 |
| 1352.0 | 56.639 |
| 1351.0 | 58.198 |
| 1350.0 | 59.548 |
| 1349.0 | 60.609 |
| 1348.0 | 61.322 |
| 1347.0 | 61.749 |
| 1346.0 | 61.938 |
| 1345.0 | 61.988 |
| 1344.0 | 62.031 |
| 1343.0 | 62.089 |
| 1342.0 | 62.207 |
| 1341.0 | 62.391 |
| 1340.0 | 62.635 |
| 1339.0 | 62.892 |
| 1338.0 | 63.115 |
| 1337.0 | 63.239 |
| 1336.0 | 63.248 |
| 1335.0 | 63.138 |
| 1334.0 | 62.904 |
| 1333.0 | 62.579 |
| 1332.0 | 62.264 |
| 1331.0 | 62.014 |
| 1330.0 | 61.893 |
| 1329.0 | 61.908 |
| 1328.0 | 62.042 |
| 1327.0 | 62.272 |
| 1326.0 | 62.527 |
| 1325.0 | 62.728 |
| 1324.0 | 62.743 |
| 1323.0 | 62.523 |
| 1322.0 | 62.003 |
| 1321.0 | 61.201 |
| 1320.0 | 60.163 |
| 1319.0 | 59 |
| 1318.0 | 57.936 |
| 1317.0 | 57.097 |
| 1316.0 | 56.5 |
| 1315.0 | 56.272 |
| 1314.0 | 56.407 |
| 1313.0 | 56.898 |
| 1312.0 | 57.636 |
| 1311.0 | 58.489 |
| 1310.0 | 59.224 |
| 1309.0 | 59.696 |
| 1308.0 | 59.776 |
| 1307.0 | 59.379 |
| 1306.0 | 58.496 |
| 1305.0 | 57.236 |
| 1304.0 | 55.837 |
| 1303.0 | 54.477 |
| 1302.0 | 53.299 |
| 1301.0 | 52.46 |
| 1300.0 | 52.029 |
| 1299.0 | 52.046 |
| 1298.0 | 52.547 |
| 1297.0 | 53.476 |
| 1296.0 | 54.697 |
| 1295.0 | 56.111 |
| 1294.0 | 57.586 |
| 1293.0 | 58.975 |
| 1292.0 | 60.062 |
| 1291.0 | 60.784 |
| 1290.0 | 61.106 |
| 1289.0 | 61.072 |
| 1288.0 | 60.811 |
| 1287.0 | 60.454 |
| 1286.0 | 60.112 |
| 1285.0 | 59.888 |
| 1284.0 | 59.841 |
| 1283.0 | 59.996 |
| 1282.0 | 60.352 |
| 1281.0 | 60.833 |
| 1280.0 | 61.335 |
| 1279.0 | 61.764 |
| 1278.0 | 62.04 |
| 1277.0 | 62.173 |
| 1276.0 | 62.167 |
| 1275.0 | 62.052 |
| 1274.0 | 61.915 |
| 1273.0 | 61.819 |
| 1272.0 | 61.781 |
| 1271.0 | 61.83 |
| 1270.0 | 61.966 |
| 1269.0 | 62.112 |
| 1268.0 | 62.223 |
| 1267.0 | 62.271 |
| 1266.0 | 62.21 |
| 1265.0 | 62.048 |
| 1264.0 | 61.838 |
| 1263.0 | 61.636 |
| 1262.0 | 61.469 |
| 1261.0 | 61.413 |
| 1260.0 | 61.469 |
| 1259.0 | 61.589 |
| 1258.0 | 61.73 |
| 1257.0 | 61.782 |
| 1256.0 | 61.685 |
| 1255.0 | 61.335 |
| 1254.0 | 60.653 |
| 1253.0 | 59.72 |
| 1252.0 | 58.607 |
| 1251.0 | 57.422 |
| 1250.0 | 56.333 |
| 1249.0 | 55.491 |
| 1248.0 | 54.98 |
| 1247.0 | 54.86 |
| 1246.0 | 55.164 |
| 1245.0 | 55.802 |
| 1244.0 | 56.619 |
| 1243.0 | 57.451 |
| 1242.0 | 58.052 |
| 1241.0 | 58.21 |
| 1240.0 | 57.812 |
| 1239.0 | 56.879 |
| 1238.0 | 55.539 |
| 1237.0 | 54.068 |
| 1236.0 | 52.748 |
| 1235.0 | 51.758 |
| 1234.0 | 51.225 |
| 1233.0 | 51.218 |
| 1232.0 | 51.753 |
| 1231.0 | 52.722 |
| 1230.0 | 53.972 |
| 1229.0 | 55.271 |
| 1228.0 | 56.373 |
| 1227.0 | 57.063 |
| 1226.0 | 57.243 |
| 1225.0 | 56.947 |
| 1224.0 | 56.313 |
| 1223.0 | 55.564 |
| 1222.0 | 54.932 |
| 1221.0 | 54.563 |
| 1220.0 | 54.523 |
| 1219.0 | 54.869 |
| 1218.0 | 55.536 |
| 1217.0 | 56.418 |
| 1216.0 | 57.393 |
| 1215.0 | 58.319 |
| 1214.0 | 59.107 |
| 1213.0 | 59.692 |
| 1212.0 | 60.102 |
| 1211.0 | 60.425 |
| 1210.0 | 60.723 |
| 1209.0 | 61.079 |
| 1208.0 | 61.557 |
| 1207.0 | 62.077 |
| 1206.0 | 62.549 |
| 1205.0 | 62.808 |
| 1204.0 | 62.631 |
| 1203.0 | 61.987 |
| 1202.0 | 60.958 |
| 1201.0 | 59.7 |
| 1200.0 | 58.441 |
| 1199.0 | 57.45 |
| 1198.0 | 56.901 |
| 1197.0 | 56.942 |
| 1196.0 | 57.606 |
| 1195.0 | 58.726 |
| 1194.0 | 60.066 |
| 1193.0 | 61.223 |
| 1192.0 | 61.794 |
| 1191.0 | 61.477 |
| 1190.0 | 60.268 |
| 1189.0 | 58.295 |
| 1188.0 | 56.087 |
| 1187.0 | 53.995 |
| 1186.0 | 52.265 |
| 1185.0 | 51.123 |
| 1184.0 | 50.608 |
| 1183.0 | 50.63 |
| 1182.0 | 51.033 |
| 1181.0 | 51.583 |
| 1180.0 | 52.038 |
| 1179.0 | 52.229 |
| 1178.0 | 52.068 |
| 1177.0 | 51.604 |
| 1176.0 | 51.042 |
| 1175.0 | 50.556 |
| 1174.0 | 50.385 |
| 1173.0 | 50.667 |
| 1172.0 | 51.441 |
| 1171.0 | 52.691 |
| 1170.0 | 54.256 |
| 1169.0 | 55.821 |
| 1168.0 | 57.218 |
| 1167.0 | 58.115 |
| 1166.0 | 58.435 |
| 1165.0 | 58.254 |
| 1164.0 | 57.825 |
| 1163.0 | 57.492 |
| 1162.0 | 57.498 |
| 1161.0 | 58.055 |
| 1160.0 | 59.163 |
| 1159.0 | 60.619 |
| 1158.0 | 62.168 |
| 1157.0 | 63.448 |
| 1156.0 | 64.215 |
| 1155.0 | 64.39 |
| 1154.0 | 64.074 |
| 1153.0 | 63.565 |
| 1152.0 | 63.219 |
| 1151.0 | 63.198 |
| 1150.0 | 63.455 |
| 1149.0 | 63.663 |
| 1148.0 | 63.366 |
| 1147.0 | 62.106 |
| 1146.0 | 59.927 |
| 1145.0 | 56.854 |
| 1144.0 | 53.444 |
| 1143.0 | 50.256 |
| 1142.0 | 47.727 |
| 1141.0 | 46.111 |
| 1140.0 | 45.535 |
| 1139.0 | 45.939 |
| 1138.0 | 47.111 |
| 1137.0 | 48.768 |
| 1136.0 | 50.436 |
| 1135.0 | 51.53 |
| 1134.0 | 51.584 |
| 1133.0 | 50.731 |
| 1132.0 | 49.188 |
| 1131.0 | 47.441 |
| 1130.0 | 45.945 |
| 1129.0 | 44.873 |
| 1128.0 | 44.339 |
| 1127.0 | 44.218 |
| 1126.0 | 44.237 |
| 1125.0 | 44.03 |
| 1124.0 | 43.293 |
| 1123.0 | 41.936 |
| 1122.0 | 40.343 |
| 1121.0 | 38.859 |
| 1120.0 | 37.864 |
| 1119.0 | 37.759 |
| 1118.0 | 38.757 |
| 1117.0 | 41.005 |
| 1116.0 | 44.287 |
| 1115.0 | 47.805 |
| 1114.0 | 50.62 |
| 1113.0 | 51.568 |
| 1112.0 | 50.305 |
| 1111.0 | 47.388 |
| 1110.0 | 44.181 |
| 1109.0 | 41.685 |
| 1108.0 | 40.514 |
| 1107.0 | 41.097 |
| 1106.0 | 43.573 |
| 1105.0 | 47.859 |
| 1104.0 | 53.564 |
| 1103.0 | 59.09 |
| 1102.0 | 63.152 |
| 1101.0 | 64.29 |
| 1100.0 | 62.6 |
| 1099.0 | 59.469 |
| 1098.0 | 56.476 |
| 1097.0 | 54.724 |
| 1096.0 | 54.83 |
| 1095.0 | 56.772 |
| 1094.0 | 60.046 |
| 1093.0 | 63.711 |
| 1092.0 | 66.676 |
| 1091.0 | 67.544 |
| 1090.0 | 66.084 |
| 1089.0 | 63.067 |
| 1088.0 | 60.108 |
| 1087.0 | 58.212 |
| 1086.0 | 57.924 |
| 1085.0 | 59.331 |
| 1084.0 | 61.911 |
| 1083.0 | 64.434 |
| 1082.0 | 65.474 |
| 1081.0 | 64.104 |
| 1080.0 | 60.578 |
| 1079.0 | 56.142 |
| 1078.0 | 52.275 |
| 1077.0 | 49.748 |
| 1076.0 | 48.901 |
| 1075.0 | 49.539 |
| 1074.0 | 51.202 |
| 1073.0 | 52.748 |
| 1072.0 | 53.608 |
| 1071.0 | 53.194 |
| 1070.0 | 51.713 |
| 1069.0 | 49.955 |
| 1068.0 | 48.649 |
| 1067.0 | 48.396 |
| 1066.0 | 49.47 |
| 1065.0 | 51.717 |
| 1064.0 | 54.423 |
| 1063.0 | 57.116 |
| 1062.0 | 58.922 |
| 1061.0 | 59.639 |
| 1060.0 | 59.634 |
| 1059.0 | 59.588 |
| 1058.0 | 60.154 |
| 1057.0 | 61.602 |
| 1056.0 | 63.745 |
| 1055.0 | 65.762 |
| 1054.0 | 66.748 |
| 1053.0 | 66.111 |
| 1052.0 | 63.976 |
| 1051.0 | 61.088 |
| 1050.0 | 58.79 |
| 1049.0 | 58.074 |
| 1048.0 | 58.943 |
| 1047.0 | 61.016 |
| 1046.0 | 63.172 |
| 1045.0 | 63.793 |
| 1044.0 | 61.78 |
| 1043.0 | 57.565 |
| 1042.0 | 52.551 |
| 1041.0 | 48.483 |
| 1040.0 | 46.173 |
| 1039.0 | 46.03 |
| 1038.0 | 47.643 |
| 1037.0 | 50.006 |
| 1036.0 | 51.255 |
| 1035.0 | 50.339 |
| 1034.0 | 47.017 |
| 1033.0 | 42.486 |
| 1032.0 | 38.677 |
| 1031.0 | 36.242 |
| 1030.0 | 35.769 |
| 1029.0 | 37.141 |
| 1028.0 | 39.894 |
| 1027.0 | 42.858 |
| 1026.0 | 44.758 |
| 1025.0 | 44.353 |
| 1024.0 | 42.221 |
| 1023.0 | 39.486 |
| 1022.0 | 37.379 |
| 1021.0 | 36.846 |
| 1020.0 | 38.242 |
| 1019.0 | 41.354 |
| 1018.0 | 45.626 |
| 1017.0 | 49.744 |
| 1016.0 | 52.482 |
| 1015.0 | 52.948 |
| 1014.0 | 51.997 |
| 1013.0 | 50.869 |
| 1012.0 | 50.92 |
| 1011.0 | 52.816 |
| 1010.0 | 56.224 |
| 1009.0 | 60.168 |
| 1008.0 | 63.03 |
| 1007.0 | 63.407 |
| 1006.0 | 61.641 |
| 1005.0 | 59.137 |
| 1004.0 | 57.737 |
| 1003.0 | 58.54 |
| 1002.0 | 61.536 |
| 1001.0 | 65.128 |
| 1000.0 | 66.578 |
| 999.0 | 64.526 |
| 998.0 | 59.34 |
| 997.0 | 52.967 |
| 996.0 | 48.254 |
| 995.0 | 45.634 |
| 994.0 | 44.888 |
| 993.0 | 45.019 |
| 992.0 | 44.491 |
| 991.0 | 42.127 |
| 990.0 | 38.293 |
| 989.0 | 33.823 |
| 988.0 | 29.809 |
| 987.0 | 27.165 |
| 986.0 | 26.112 |
| 985.0 | 26.239 |
| 984.0 | 27.183 |
| 983.0 | 28.463 |
| 982.0 | 29.452 |
| 981.0 | 29.889 |
| 980.0 | 29.669 |
| 979.0 | 29.119 |
| 978.0 | 28.578 |
| 977.0 | 28.23 |
| 976.0 | 28.138 |
| 975.0 | 28.285 |
| 974.0 | 28.519 |
| 973.0 | 28.81 |
| 972.0 | 29.272 |
| 971.0 | 30.082 |
| 970.0 | 31.358 |
| 969.0 | 33.098 |
| 968.0 | 34.998 |
| 967.0 | 36.736 |
| 966.0 | 37.816 |
| 965.0 | 38.332 |
| 964.0 | 38.557 |
| 963.0 | 39.182 |
| 962.0 | 40.997 |
| 961.0 | 44.511 |
| 960.0 | 49.485 |
| 959.0 | 55.121 |
| 958.0 | 60.731 |
| 957.0 | 65.09 |
| 956.0 | 67.69 |
| 955.0 | 69.513 |
| 954.0 | 71.276 |
| 953.0 | 73.71 |
| 952.0 | 76.783 |
| 951.0 | 79.682 |
| 950.0 | 81.979 |
| 949.0 | 83.639 |
| 948.0 | 84.76 |
| 947.0 | 85.327 |
| 946.0 | 85.13 |
| 945.0 | 83.589 |
| 944.0 | 80.315 |
| 943.0 | 75.941 |
| 942.0 | 71.504 |
| 941.0 | 67.936 |
| 940.0 | 66.184 |
| 939.0 | 66.567 |
| 938.0 | 68.603 |
| 937.0 | 71.398 |
| 936.0 | 73.826 |
| 935.0 | 75.118 |
| 934.0 | 75.368 |
| 933.0 | 74.89 |
| 932.0 | 74.398 |
| 931.0 | 74.4 |
| 930.0 | 74.985 |
| 929.0 | 75.968 |
| 928.0 | 77.003 |
| 927.0 | 77.951 |
| 926.0 | 78.881 |
| 925.0 | 79.907 |
| 924.0 | 81.057 |
| 923.0 | 82.266 |
| 922.0 | 83.431 |
| 921.0 | 84.428 |
| 920.0 | 85.144 |
| 919.0 | 85.574 |
| 918.0 | 85.599 |
| 917.0 | 85.107 |
| 916.0 | 84.148 |
| 915.0 | 82.877 |
| 914.0 | 81.743 |
| 913.0 | 81.098 |
| 912.0 | 81.042 |
| 911.0 | 81.371 |
| 910.0 | 81.589 |
| 909.0 | 81.421 |
| 908.0 | 80.821 |
| 907.0 | 80.056 |
| 906.0 | 79.612 |
| 905.0 | 79.714 |
| 904.0 | 80.259 |
| 903.0 | 81.036 |
| 902.0 | 81.705 |
| 901.0 | 82.2 |
| 900.0 | 82.595 |
| 899.0 | 83.046 |
| 898.0 | 83.755 |
| 897.0 | 84.7 |
| 896.0 | 85.666 |
| 895.0 | 86.581 |
| 894.0 | 87.402 |
| 893.0 | 88.173 |
| 892.0 | 88.955 |
| 891.0 | 89.822 |
| 890.0 | 90.691 |
| 889.0 | 91.426 |
| 888.0 | 91.969 |
| 887.0 | 92.277 |
| 886.0 | 92.325 |
| 885.0 | 92.113 |
| 884.0 | 91.731 |
| 883.0 | 91.24 |
| 882.0 | 90.711 |
| 881.0 | 90.226 |
| 880.0 | 89.804 |
| 879.0 | 89.362 |
| 878.0 | 88.875 |
| 877.0 | 88.375 |
| 876.0 | 87.911 |
| 875.0 | 87.601 |
| 874.0 | 87.485 |
| 873.0 | 87.518 |
| 872.0 | 87.685 |
| 871.0 | 87.933 |
| 870.0 | 88.199 |
| 869.0 | 88.608 |
| 868.0 | 89.172 |
| 867.0 | 89.896 |
| 866.0 | 90.774 |
| 865.0 | 91.695 |
| 864.0 | 92.603 |
| 863.0 | 93.419 |
| 862.0 | 94.077 |
| 861.0 | 94.544 |
| 860.0 | 94.793 |
| 859.0 | 95.267 |
| 858.0 | 95.776 |
| 857.0 | 95.563 |
| 856.0 | 94.581 |
| 855.0 | 93.625 |
| 854.0 | 93.452 |
| 853.0 | 94.132 |
| 852.0 | 95.177 |
| 851.0 | 95.751 |
| 850.0 | 95.734 |
| 849.0 | 95.746 |
| 848.0 | 96.181 |
| 847.0 | 96.701 |
| 846.0 | 96.851 |
| 845.0 | 96.336 |
| 844.0 | 95.493 |
| 843.0 | 95.332 |
| 842.0 | 96.08 |
| 841.0 | 97.095 |
| 840.0 | 97.591 |
| 839.0 | 97.147 |
| 838.0 | 96.298 |
| 837.0 | 96.116 |
| 836.0 | 96.883 |
| 835.0 | 97.788 |
| 834.0 | 98.029 |
| 833.0 | 97.449 |
| 832.0 | 96.696 |
| 831.0 | 96.677 |
| 830.0 | 97.503 |
| 829.0 | 98.333 |
| 828.0 | 98.376 |
| 827.0 | 97.719 |
| 826.0 | 97.266 |
| 825.0 | 97.615 |
| 824.0 | 98.349 |
| 823.0 | 98.533 |
| 822.0 | 97.915 |
| 821.0 | 97.097 |
| 820.0 | 96.897 |
| 819.0 | 97.622 |
| 818.0 | 98.541 |
| 817.0 | 98.651 |
| 816.0 | 98.034 |
| 815.0 | 97.526 |
| 814.0 | 97.674 |
| 813.0 | 98.397 |
| 812.0 | 98.953 |
| 811.0 | 98.905 |
| 810.0 | 98.628 |
| 809.0 | 98.641 |
| 808.0 | 98.964 |
| 807.0 | 99.232 |
| 806.0 | 99.118 |
| 805.0 | 98.836 |
| 804.0 | 98.872 |
| 803.0 | 99.159 |
| 802.0 | 99.202 |
| 801.0 | 98.814 |
| 800.0 | 98.368 |
| 799.0 | 98.468 |
| 798.0 | 98.961 |
| 797.0 | 98.976 |
| 796.0 | 97.992 |
| 795.0 | 96.859 |
| 794.0 | 96.642 |
| 793.0 | 97.544 |
| 792.0 | 98.659 |
| 791.0 | 98.707 |
| 790.0 | 97.651 |
| 789.0 | 96.82 |
| 788.0 | 97.233 |
| 787.0 | 98.378 |
| 786.0 | 98.892 |
| 785.0 | 98.229 |
| 784.0 | 97.372 |
| 783.0 | 97.504 |
| 782.0 | 98.422 |
| 781.0 | 99.065 |
| 780.0 | 98.908 |
| 779.0 | 98.437 |
| 778.0 | 98.432 |
| 777.0 | 98.964 |
| 776.0 | 99.081 |
| 775.0 | 98.462 |
| 774.0 | 97.895 |
| 773.0 | 97.994 |
| 772.0 | 98.517 |
| 771.0 | 98.824 |
| 770.0 | 98.471 |
| 769.0 | 98.041 |
| 768.0 | 98.288 |
| 767.0 | 98.819 |
| 766.0 | 98.866 |
| 765.0 | 98.419 |
| 764.0 | 98.132 |
| 763.0 | 98.454 |
| 762.0 | 99.03 |
| 761.0 | 99.122 |
| 760.0 | 98.625 |
| 759.0 | 98.384 |
| 758.0 | 98.704 |
| 757.0 | 99.12 |
| 756.0 | 99.165 |
| 755.0 | 98.795 |
| 754.0 | 98.525 |
| 753.0 | 98.799 |
| 752.0 | 99.233 |
| 751.0 | 99.399 |
| 750.0 | 99.375 |
| 749.0 | 99.312 |
| 748.0 | 99.311 |
| 747.0 | 99.444 |
| 746.0 | 99.475 |
| 745.0 | 99.391 |
| 744.0 | 99.399 |
| 743.0 | 99.443 |
| 742.0 | 99.445 |
| 741.0 | 99.475 |
| 740.0 | 99.366 |
| 739.0 | 99.497 |
| 738.0 | 99.499 |
| 737.0 | 99.277 |
| 736.0 | 99.556 |
| 735.0 | 99.565 |
| 734.0 | 99.856 |
| 733.0 | 98.569 |
| 732.0 | 99.075 |
| 731.0 | 99.29 |
| 730.0 | 98.718 |
| 729.0 | 99.819 |
| 728.0 | 99.495 |
| 727.0 | 99.992 |
| 726.0 | 97.896 |
| 725.0 | 98.487 |
| 724.0 | 98.573 |
| 723.0 | 98.664 |
| 722.0 | 98.686 |
| 721.0 | 98.961 |
| 720.0 | 98.764 |
| 719.0 | 99.484 |
| 718.0 | 98.7 |
| 717.0 | 99.363 |
| 716.0 | 99.519 |
| 715.0 | 99.087 |
| 714.0 | 98.287 |
| 713.0 | 98.71 |
| 712.0 | 98.789 |
| 711.0 | 98.405 |
| 710.0 | 99.728 |
| 709.0 | 99.1 |
| 708.0 | 98.806 |
| 707.0 | 99.438 |
| 706.0 | 98.957 |
| 705.0 | 98.595 |
| 704.0 | 99.235 |
| 703.0 | 99.874 |
| 702.0 | 98.509 |
| 701.0 | 98.368 |
| 700.0 | 99.688 |
| 699.0 | 99.837 |
| 698.0 | 99.272 |
| 697.0 | 98.805 |
| 696.0 | 99.419 |
| 695.0 | 98.973 |
| 694.0 | 98.893 |
| 693.0 | 98.744 |
| 692.0 | 99.132 |
| 691.0 | 98.849 |
| 690.0 | 99.093 |
| 689.0 | 98.868 |
| 688.0 | 98.677 |
| 687.0 | 99.23 |
| 686.0 | 99.198 |
| 685.0 | 99.04 |
| 684.0 | 99.016 |
| 683.0 | 99.236 |
| 682.0 | 99.174 |
| 681.0 | 99.43 |
| 680.0 | 99.704 |
| 679.0 | 99.143 |
| 678.0 | 99.116 |
| 677.0 | 99.042 |
| 676.0 | 99.348 |
| 675.0 | 99.225 |
| 674.0 | 98.945 |
| 673.0 | 98.83 |
| 672.0 | 99.263 |
| 671.0 | 99.543 |
| 670.0 | 99.166 |
| 669.0 | 98.673 |
| 668.0 | 98.641 |
| 667.0 | 99.589 |
| 666.0 | 99.726 |
| 665.0 | 99.467 |
| 664.0 | 99.574 |
| 663.0 | 99.792 |
| 662.0 | 99.411 |
| 661.0 | 99.326 |
| 660.0 | 99.309 |
| 659.0 | 99.073 |
| 658.0 | 99.287 |
| 657.0 | 99.989 |
| 656.0 | 99.623 |
| 655.0 | 98.702 |
| 654.0 | 99.326 |
| 653.0 | 99.411 |
| 652.0 | 98.822 |
| 651.0 | 98.611 |
| 650.0 | 98.757 |
| 649.0 | 99.066 |
| 648.0 | 99.468 |
| 647.0 | 99.705 |
| 646.0 | 99.657 |
| 645.0 | 99.419 |
| 644.0 | 98.615 |
| 643.0 | 98.221 |
| 642.0 | 98.369 |
| 641.0 | 98.509 |
| 640.0 | 98.738 |
| 639.0 | 99.325 |
| 638.0 | 98.98 |
| 637.0 | 99.133 |
| 636.0 | 98.617 |
| 635.0 | 98.818 |
| 634.0 | 99.081 |
| 633.0 | 99.045 |
| 632.0 | 98.836 |
| 631.0 | 98.906 |
| 630.0 | 98.482 |
| 629.0 | 98.662 |
| 628.0 | 98.831 |
| 627.0 | 98.352 |
| 626.0 | 98.349 |
| 625.0 | 98.54 |
| 624.0 | 98.369 |
| 623.0 | 98.615 |
| 622.0 | 99.083 |
| 621.0 | 98.985 |
| 620.0 | 98.599 |
| 619.0 | 98.688 |
| 618.0 | 98.629 |
| 617.0 | 98.841 |
| 616.0 | 98.368 |
| 615.0 | 98.454 |
| 614.0 | 98.769 |
| 613.0 | 98.908 |
| 612.0 | 98.791 |
| 611.0 | 98.842 |
| 610.0 | 98.228 |
| 609.0 | 98.64 |
| 608.0 | 98.771 |
| 607.0 | 98.456 |
| 606.0 | 98.505 |
| 605.0 | 98.595 |
| 604.0 | 98.258 |
| 603.0 | 97.988 |
| 602.0 | 97.575 |
| 601.0 | 98.13 |
| 600.0 | 98.536 |
| 599.0 | 98.255 |
| 598.0 | 98.234 |
| 597.0 | 98.51 |
| 596.0 | 98.034 |
| 595.0 | 98.85 |
| 594.0 | 98.668 |
| 593.0 | 98.395 |
| 592.0 | 98.422 |
| 591.0 | 98.815 |
| 590.0 | 98.457 |
| 589.0 | 97.941 |
| 588.0 | 97.953 |
| 587.0 | 98.025 |
| 586.0 | 97.567 |
| 585.0 | 98.124 |
| 584.0 | 97.853 |
| 583.0 | 98.04 |
| 582.0 | 96.95 |
| 581.0 | 96.836 |
| 580.0 | 97.659 |
| 579.0 | 97.344 |
| 578.0 | 96.847 |
| 577.0 | 96.733 |
| 576.0 | 96.459 |
| 575.0 | 95.386 |
| 574.0 | 94.819 |
| 573.0 | 61.691 |
| 572.0 | 40.963 |
| 571.0 | 17.061 |
| 570.0 | 0.012 |
| 569.0 | 0.001 |
| 568.0 | 0 |
| 567.0 | 0 |
| 566.0 | 0 |
| 565.0 | 0 |
| 564.0 | 0 |
| 563.0 | 0 |
| 562.0 | 0 |
| 561.0 | 0 |
| 560.0 | 0 |
| 559.0 | 0.005 |
| 558.0 | 0.073 |
| 557.0 | 15.105 |
| 556.0 | 52.188 |
| 555.0 | 82.317 |
| 554.0 | 91.943 |
| 553.0 | 94.95 |
| 552.0 | 95.443 |
| 551.0 | 96.385 |
| 550.0 | 97.682 |
| 549.0 | 97.157 |
| 548.0 | 96.948 |
| 547.0 | 96.421 |
| 546.0 | 96.646 |
| 545.0 | 97.68 |
| 544.0 | 98.251 |
| 543.0 | 97.826 |
| 542.0 | 97.48 |
| 541.0 | 97.219 |
| 540.0 | 97.424 |
| 539.0 | 97.984 |
| 538.0 | 98.368 |
| 537.0 | 98.238 |
| 536.0 | 97.978 |
| 535.0 | 97.781 |
| 534.0 | 97.649 |
| 533.0 | 97.933 |
| 532.0 | 98.356 |
| 531.0 | 98.336 |
| 530.0 | 97.815 |
| 529.0 | 97.179 |
| 528.0 | 97.664 |
| 527.0 | 98.315 |
| 526.0 | 98.79 |
| 525.0 | 98.315 |
| 524.0 | 97.74 |
| 523.0 | 97.186 |
| 522.0 | 97.528 |
| 521.0 | 98.43 |
| 520.0 | 98.773 |
| 519.0 | 97.886 |
| 518.0 | 97.472 |
| 517.0 | 97.422 |
| 516.0 | 97.89 |
| 515.0 | 97.955 |
| 514.0 | 98.381 |
| 513.0 | 98.206 |
| 512.0 | 97.712 |
| 511.0 | 97.31 |
| 510.0 | 98.019 |
| 509.0 | 98.936 |
| 508.0 | 99.283 |
| 507.0 | 98.768 |
| 506.0 | 98.16 |
| 505.0 | 97.687 |
| 504.0 | 97.911 |
| 503.0 | 98.772 |
| 502.0 | 99.24 |
| 501.0 | 98.266 |
| 500.0 | 97.995 |
| 499.0 | 97.513 |
| 498.0 | 97.911 |
| 497.0 | 99.021 |
| 496.0 | 98.306 |
| 495.0 | 97.664 |
| 494.0 | 97.485 |
| 493.0 | 96.7 |
| 492.0 | 97.414 |
| 491.0 | 98.133 |
| 490.0 | 98.369 |
| 489.0 | 97.513 |
| 488.0 | 97.384 |
| 487.0 | 97.447 |
| 486.0 | 97.238 |
| 485.0 | 98.406 |
| 484.0 | 98.763 |
| 483.0 | 97.796 |
| 482.0 | 97.606 |
| 481.0 | 97.464 |
| 480.0 | 97.794 |
| 479.0 | 98.539 |
| 478.0 | 99.006 |
| 477.0 | 97.737 |
| 476.0 | 97.412 |
| 475.0 | 97.599 |
| 474.0 | 97.205 |
| 473.0 | 97.908 |
| 472.0 | 98.235 |
| 471.0 | 96.81 |
| 470.0 | 97.162 |
| 469.0 | 97.158 |
| 468.0 | 97.315 |
| 467.0 | 97.852 |
| 466.0 | 98.67 |
| 465.0 | 97.802 |
| 464.0 | 97.047 |
| 463.0 | 96.8 |
| 462.0 | 98.059 |
| 461.0 | 98.398 |
| 460.0 | 98.589 |
| 459.0 | 98.155 |
| 458.0 | 97.899 |
| 457.0 | 97.344 |
| 456.0 | 97.438 |
| 455.0 | 97.37 |
| 454.0 | 97.607 |
| 453.0 | 97.716 |
| 452.0 | 97.184 |
| 451.0 | 96.644 |
| 450.0 | 97.464 |
| 449.0 | 98.304 |
| 448.0 | 98.122 |
| 447.0 | 97.103 |
| 446.0 | 96.299 |
| 445.0 | 96.188 |
| 444.0 | 96.348 |
| 443.0 | 97.845 |
| 442.0 | 97.777 |
| 441.0 | 96.465 |
| 440.0 | 96.371 |
| 439.0 | 96.066 |
| 438.0 | 96.96 |
| 437.0 | 97.913 |
| 436.0 | 96.953 |
| 435.0 | 95.369 |
| 434.0 | 95.465 |
| 433.0 | 95.516 |
| 432.0 | 95.41 |
| 431.0 | 96.395 |
| 430.0 | 96.358 |
| 429.0 | 94.479 |
| 428.0 | 94.864 |
| 427.0 | 94.427 |
| 426.0 | 94.931 |
| 425.0 | 95.137 |
| 424.0 | 94.906 |
| 423.0 | 94.697 |
| 422.0 | 94.405 |
| 421.0 | 94.19 |
| 420.0 | 94.03 |
| 419.0 | 93.867 |
| 418.0 | 93.641 |
| 417.0 | 93.255 |
| 416.0 | 92.786 |
| 415.0 | 92.32 |
| 414.0 | 91.86 |
| 413.0 | 91.364 |
| 412.0 | 90.763 |
| 411.0 | 90.096 |
| 410.0 | 89.511 |
| 409.0 | 88.896 |
| 408.0 | 88.079 |
| 407.0 | 87.081 |
| 406.0 | 85.798 |
| 405.0 | 83.429 |
| 404.0 | 74.316 |
| 403.0 | 53.028 |
| 402.0 | 26.541 |
| 401.0 | 8.347 |
| 400.0 | 1.52 |
| 399.0 | 0.172 |
| 398.0 | 0.02 |
| 397.0 | 0.003 |
| 396.0 | 0.004 |
| 395.0 | 0.006 |
| 394.0 | 0.003 |
| 393.0 | 0.003 |
| 392.0 | 0.006 |
| 391.0 | 0.002 |
| 390.0 | 0.004 |
| 389.0 | 0.002 |
| 388.0 | 0.001 |
| 387.0 | 0.004 |
| 386.0 | 0.005 |
| 385.0 | 0.003 |
| 384.0 | 0.005 |
| 383.0 | 0.001 |
| 382.0 | 0.001 |
| 381.0 | 0.004 |
| 380.0 | 0.005 |
| 379.0 | 0.002 |
| 378.0 | 0.005 |
| 377.0 | 0.004 |
| 376.0 | 0.005 |
| 375.0 | 0.001 |
| 374.0 | 0.003 |
| 373.0 | 0 |
| 372.0 | 0 |
| 371.0 | 0.003 |
| 370.0 | 0.006 |
| 369.0 | 0.002 |
| 368.0 | 0.004 |
| 367.0 | 0.002 |
| 366.0 | 0.001 |
| 365.0 | 0.003 |
| 364.0 | 0.005 |
| 363.0 | 0.002 |
| 362.0 | 0.005 |
| 361.0 | 0.002 |
| 360.0 | 0.002 |
| 359.0 | 0.004 |
| 358.0 | 0.005 |
| 357.0 | 0.005 |
| 356.0 | 0.005 |
| 355.0 | 0.003 |
| 354.0 | 0.001 |
| 353.0 | 0.004 |
| 352.0 | 0.005 |
| 351.0 | 0.002 |
| 350.0 | 0.005 |
| 349.0 | 0.002 |
| 348.0 | 0 |
| 347.0 | 0.005 |
| 346.0 | 0.005 |
| 345.0 | 0.003 |
| 344.0 | 0.005 |
| 343.0 | 0.003 |
| 342.0 | 0.002 |
| 341.0 | 0.004 |
| 340.0 | 0.005 |
| 339.0 | 0.003 |
| 338.0 | 0.004 |
| 337.0 | 0.002 |
| 336.0 | 0.002 |
| 335.0 | 0.006 |
| 334.0 | 0.004 |
| 333.0 | 0.002 |
| 332.0 | 0.004 |
| 331.0 | 0.002 |
| 330.0 | 0.001 |
| 329.0 | 0.004 |
| 328.0 | 0.005 |
| 327.0 | 0.002 |
| 326.0 | 0.004 |
| 325.0 | 0.004 |
| 324.0 | 0.001 |
| 323.0 | 0.006 |
| 322.0 | 0.005 |
| 321.0 | 0.002 |
| 320.0 | 0.005 |
| 319.0 | 0.002 |
| 318.0 | 0.005 |
| 317.0 | 0.005 |
| 316.0 | 0.006 |
| 315.0 | 0.004 |
| 314.0 | 0.005 |
| 313.0 | 0.001 |
| 312.0 | 0 |
| 311.0 | 0.004 |
| 310.0 | 0.006 |
| 309.0 | 0.001 |
| 308.0 | 0.004 |
| 307.0 | 0 |
| 306.0 | 0.003 |
| 305.0 | 0.005 |
| 304.0 | 0.004 |
| 303.0 | 0.004 |
| 302.0 | 0.005 |
| 301.0 | 0 |
| 300.0 | 0.001 |
| 299.0 | 0.005 |
| 298.0 | 0.005 |
| 297.0 | 0.005 |
| 296.0 | 0.004 |
| 295.0 | 0.001 |
| 294.0 | 0.001 |
| 293.0 | 0.005 |
| 292.0 | 0.006 |
| 291.0 | 0.001 |
| 290.0 | 0.004 |
| 289.0 | 0.001 |
| 288.0 | 0 |
| 287.0 | 0.005 |
| 286.0 | 0.005 |
| 285.0 | 0.006 |
| 284.0 | 0.003 |
| 283.0 | 0.001 |
| 282.0 | 0.001 |
| 281.0 | 0.005 |
| 280.0 | 0.005 |
| 279.0 | 0.003 |
| 278.0 | 0.004 |
| 277.0 | 0.002 |
| 276.0 | 0.001 |
| 275.0 | 0.007 |
| 274.0 | 0.004 |
| 273.0 | 0.003 |
| 272.0 | 0.005 |
| 271.0 | 0.002 |
| 270.0 | 0.001 |
| 269.0 | 0.007 |
| 268.0 | 0.007 |
| 267.0 | 0.002 |
| 266.0 | 0.001 |
| 265.0 | 0.001 |
| 264.0 | 0.001 |
| 263.0 | 0.005 |
| 262.0 | 0.006 |
| 261.0 | 0.005 |
| 260.0 | 0.005 |
| 259.0 | 0.002 |
| 258.0 | 0.002 |
| 257.0 | 0.006 |
| 256.0 | 0.006 |
| 255.0 | 0.006 |
| 254.0 | 0.004 |
| 253.0 | 0 |
| 252.0 | 0.003 |
| 251.0 | 0.005 |
| 250.0 | 0.007 |
| 249.0 | 0.001 |
| 248.0 | 0.005 |
| 247.0 | 0.001 |
| 246.0 | 0.002 |
| 245.0 | 0.006 |
| 244.0 | 0.007 |
| 243.0 | 0.004 |
| 242.0 | 0.006 |
| 241.0 | 0.001 |
| 240.0 | 0.002 |
| 239.0 | 0.005 |
| 238.0 | 0.006 |
| 237.0 | 0.003 |
| 236.0 | 0.005 |
| 235.0 | 0.001 |
| 234.0 | 0.003 |
| 233.0 | 0.005 |
| 232.0 | 0.008 |
| 231.0 | 0.001 |
| 230.0 | 0.006 |
| 229.0 | 0 |
| 228.0 | 0.003 |
| 227.0 | 0.004 |
| 226.0 | 0.005 |
| 225.0 | 0.005 |
| 224.0 | 0.005 |
| 223.0 | 0.001 |
| 222.0 | 0.002 |
| 221.0 | 0.005 |
| 220.0 | 0.007 |
| 219.0 | 0.002 |
| 218.0 | 0.006 |
| 217.0 | 0.002 |
| 216.0 | 0.002 |
| 215.0 | 0.007 |
| 214.0 | 0.007 |
| 213.0 | 0.006 |
| 212.0 | 0.007 |
| 211.0 | 0.003 |
| 210.0 | 0.004 |
| 209.0 | 0.007 |
| 208.0 | 0.007 |
| 207.0 | 0.004 |
| 206.0 | 0.005 |
| 205.0 | 0.004 |
| 204.0 | 0.005 |
| 203.0 | 0.01 |
| 202.0 | 0.009 |
| 201.0 | 0.01 |